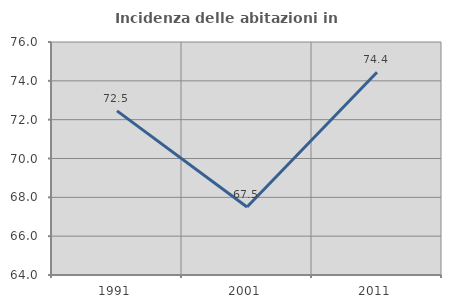
| Category | Incidenza delle abitazioni in proprietà  |
|---|---|
| 1991.0 | 72.451 |
| 2001.0 | 67.5 |
| 2011.0 | 74.443 |